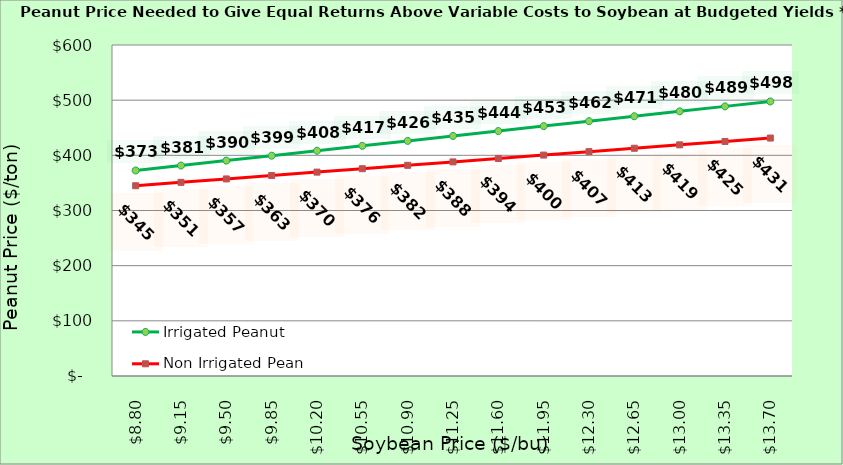
| Category | Irrigated Peanut | Non Irrigated Peanut |
|---|---|---|
| 8.800000000000002 | 372.56 | 344.871 |
| 9.150000000000002 | 381.496 | 351.047 |
| 9.500000000000002 | 390.433 | 357.224 |
| 9.850000000000001 | 399.369 | 363.4 |
| 10.200000000000001 | 408.305 | 369.577 |
| 10.55 | 417.241 | 375.753 |
| 10.9 | 426.177 | 381.93 |
| 11.25 | 435.114 | 388.106 |
| 11.6 | 444.05 | 394.282 |
| 11.95 | 452.986 | 400.459 |
| 12.299999999999999 | 461.922 | 406.635 |
| 12.649999999999999 | 470.858 | 412.812 |
| 12.999999999999998 | 479.794 | 418.988 |
| 13.349999999999998 | 488.731 | 425.165 |
| 13.699999999999998 | 497.667 | 431.341 |